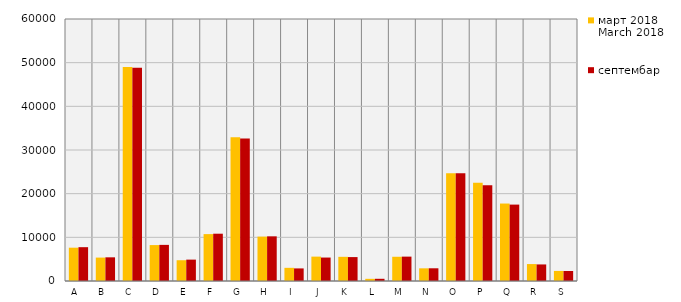
| Category | март 2018
March 2018 | септембар 2017
September 2017 |
|---|---|---|
| A  | 7629 | 7745 |
| B  | 5361 | 5421 |
| C  | 49000 | 48814 |
| D  | 8226 | 8272 |
| Е  | 4756 | 4897 |
| F  | 10738 | 10831 |
| G  | 32938 | 32605 |
| H  | 10162 | 10227 |
| I  | 3015 | 2882 |
| J  | 5583 | 5371 |
| K  | 5536 | 5476 |
| L  | 497 | 504 |
| M  | 5550 | 5583 |
| N  | 2902 | 2911 |
| O  | 24697 | 24661 |
| P  | 22492 | 21902 |
| Q  | 17740 | 17497 |
| R  | 3878 | 3792 |
| S  | 2307 | 2294 |